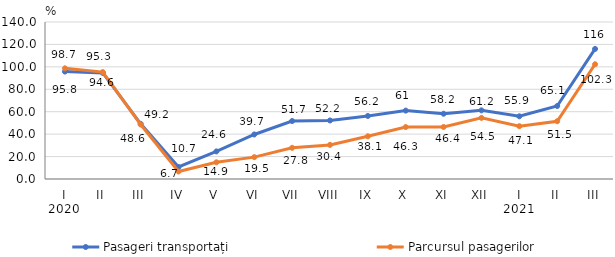
| Category | Pasageri transportați | Parcursul pasagerilor |
|---|---|---|
| 0 | 95.8 | 98.7 |
| 1 | 94.6 | 95.3 |
| 2 | 49.2 | 48.6 |
| 3 | 10.7 | 6.7 |
| 4 | 24.6 | 14.9 |
| 5 | 39.7 | 19.5 |
| 6 | 51.7 | 27.8 |
| 7 | 52.2 | 30.4 |
| 8 | 56.2 | 38.1 |
| 9 | 61 | 46.3 |
| 10 | 58.2 | 46.4 |
| 11 | 61.2 | 54.5 |
| 12 | 55.9 | 47.1 |
| 13 | 65.1 | 51.5 |
| 14 | 116 | 102.3 |